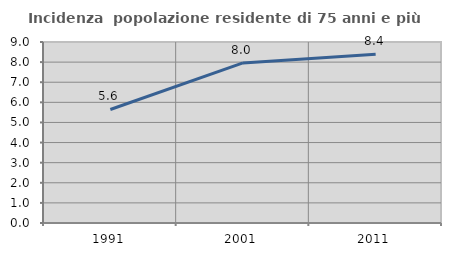
| Category | Incidenza  popolazione residente di 75 anni e più |
|---|---|
| 1991.0 | 5.645 |
| 2001.0 | 7.96 |
| 2011.0 | 8.389 |